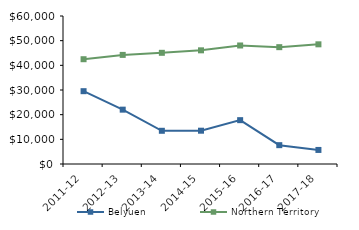
| Category | Belyuen | Northern Territory |
|---|---|---|
| 2011-12 | 29520.95 | 42481 |
| 2012-13 | 22033 | 44232.02 |
| 2013-14 | 13464.92 | 45075.51 |
| 2014-15 | 13500 | 46083.65 |
| 2015-16 | 17774.49 | 48046.27 |
| 2016-17 | 7635.97 | 47367.05 |
| 2017-18 | 5700 | 48519 |